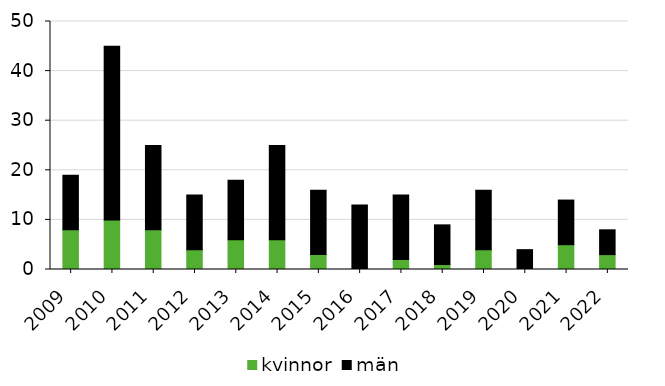
| Category | kvinnor | män |
|---|---|---|
| 2009 | 8 | 11 |
| 2010 | 10 | 35 |
| 2011 | 8 | 17 |
| 2012 | 4 | 11 |
| 2013 | 6 | 12 |
| 2014 | 6 | 19 |
| 2015 | 3 | 13 |
| 2016 | 0 | 13 |
| 2017 | 2 | 13 |
| 2018 | 1 | 8 |
| 2019 | 4 | 12 |
| 2020 | 0 | 4 |
| 2021 | 5 | 9 |
| 2022 | 3 | 5 |